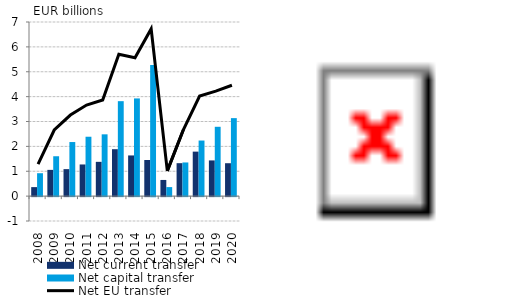
| Category | Net current transfer | Net capital transfer |
|---|---|---|
| 2008.0 | 0.362 | 0.921 |
| 2009.0 | 1.055 | 1.603 |
| 2010.0 | 1.085 | 2.174 |
| 2011.0 | 1.273 | 2.387 |
| 2012.0 | 1.378 | 2.484 |
| 2013.0 | 1.887 | 3.817 |
| 2014.0 | 1.635 | 3.928 |
| 2015.0 | 1.452 | 5.271 |
| 2016.0 | 0.65 | 0.363 |
| 2017.0 | 1.325 | 1.353 |
| 2018.0 | 1.789 | 2.235 |
| 2019.0 | 1.435 | 2.787 |
| 2020.0 | 1.323 | 3.135 |